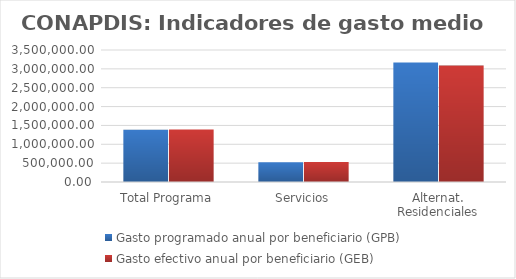
| Category | Gasto programado anual por beneficiario (GPB)  | Gasto efectivo anual por beneficiario (GEB)  |
|---|---|---|
| Total Programa | 1388053.439 | 1393753.539 |
| Servicios | 521589.374 | 532652.649 |
| Alternat. Residenciales | 3171572.148 | 3087095.959 |